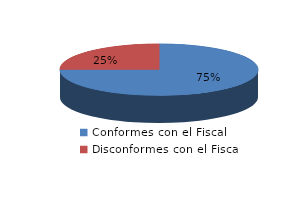
| Category | Series 0 |
|---|---|
| 0 | 1742 |
| 1 | 581 |